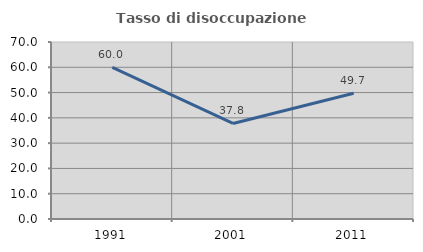
| Category | Tasso di disoccupazione giovanile  |
|---|---|
| 1991.0 | 60 |
| 2001.0 | 37.788 |
| 2011.0 | 49.714 |